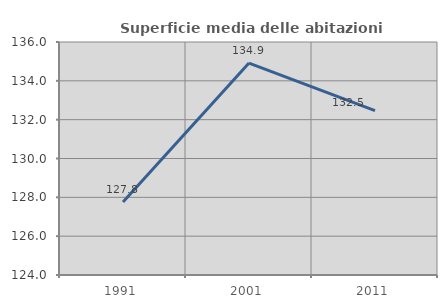
| Category | Superficie media delle abitazioni occupate |
|---|---|
| 1991.0 | 127.758 |
| 2001.0 | 134.915 |
| 2011.0 | 132.462 |